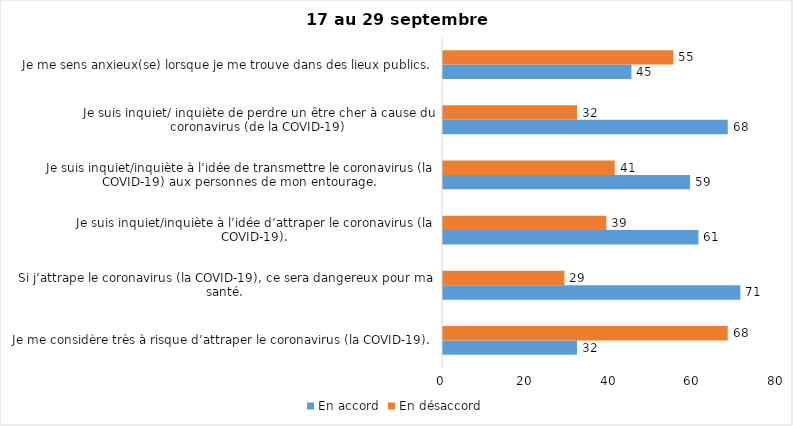
| Category | En accord | En désaccord |
|---|---|---|
| Je me considère très à risque d’attraper le coronavirus (la COVID-19). | 32 | 68 |
| Si j’attrape le coronavirus (la COVID-19), ce sera dangereux pour ma santé. | 71 | 29 |
| Je suis inquiet/inquiète à l’idée d’attraper le coronavirus (la COVID-19). | 61 | 39 |
| Je suis inquiet/inquiète à l’idée de transmettre le coronavirus (la COVID-19) aux personnes de mon entourage. | 59 | 41 |
| Je suis inquiet/ inquiète de perdre un être cher à cause du coronavirus (de la COVID-19) | 68 | 32 |
| Je me sens anxieux(se) lorsque je me trouve dans des lieux publics. | 45 | 55 |